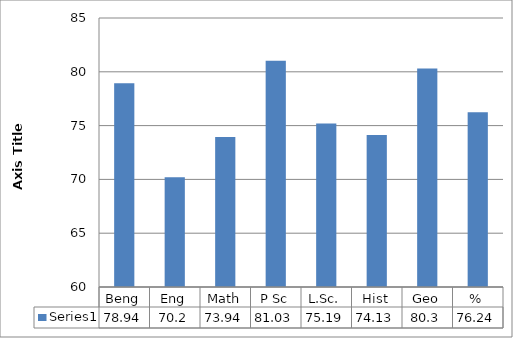
| Category | Series 0 |
|---|---|
| Beng | 78.94 |
| Eng | 70.2 |
| Math | 73.94 |
| P Sc | 81.03 |
| L.Sc. | 75.19 |
| Hist | 74.13 |
| Geo | 80.3 |
| % | 76.24 |